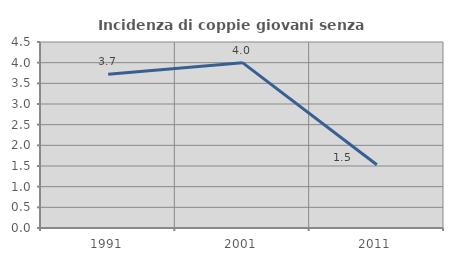
| Category | Incidenza di coppie giovani senza figli |
|---|---|
| 1991.0 | 3.721 |
| 2001.0 | 4 |
| 2011.0 | 1.531 |